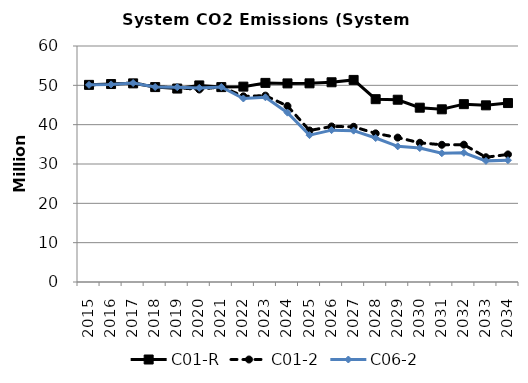
| Category | C01-R | C01-2 | C06-2 |
|---|---|---|---|
| 2015.0 | 50.118 | 50.118 | 50.119 |
| 2016.0 | 50.329 | 50.238 | 50.239 |
| 2017.0 | 50.499 | 50.622 | 50.588 |
| 2018.0 | 49.555 | 49.636 | 49.579 |
| 2019.0 | 49.181 | 49.421 | 49.527 |
| 2020.0 | 49.976 | 48.938 | 49.352 |
| 2021.0 | 49.548 | 49.665 | 49.573 |
| 2022.0 | 49.671 | 47.203 | 46.655 |
| 2023.0 | 50.618 | 47.383 | 46.956 |
| 2024.0 | 50.491 | 44.746 | 43.05 |
| 2025.0 | 50.508 | 38.519 | 37.334 |
| 2026.0 | 50.777 | 39.539 | 38.605 |
| 2027.0 | 51.38 | 39.462 | 38.483 |
| 2028.0 | 46.481 | 37.785 | 36.603 |
| 2029.0 | 46.342 | 36.715 | 34.487 |
| 2030.0 | 44.317 | 35.397 | 34.057 |
| 2031.0 | 43.901 | 34.881 | 32.739 |
| 2032.0 | 45.215 | 34.915 | 32.852 |
| 2033.0 | 44.915 | 31.713 | 30.796 |
| 2034.0 | 45.496 | 32.435 | 30.959 |